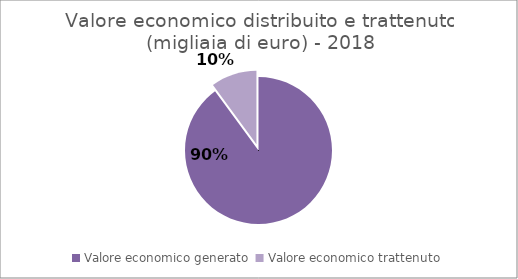
| Category | Series 1 |
|---|---|
| Valore economico generato  | 2748210 |
| Valore economico trattenuto | 307840 |